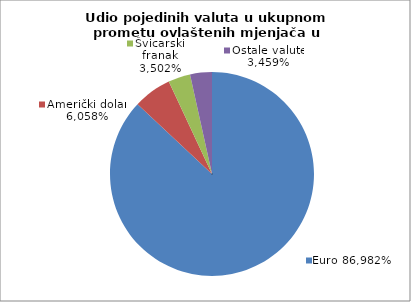
| Category | EUR |
|---|---|
| 0 | 0.87 |
| 1 | 0.061 |
| 2 | 0.035 |
| 3 | 0.035 |